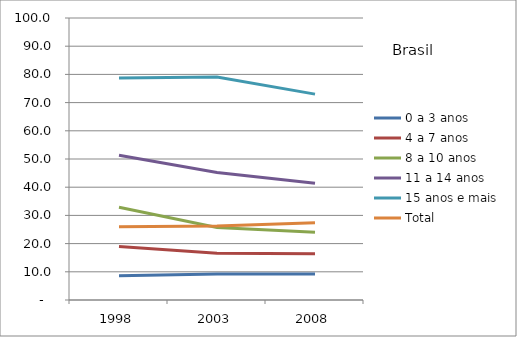
| Category | 0 a 3 anos | 4 a 7 anos | 8 a 10 anos | 11 a 14 anos | 15 anos e mais | Total |
|---|---|---|---|---|---|---|
| 1998 | 8.6 | 19 | 32.9 | 51.3 | 78.7 | 26 |
| 2003 | 9.2 | 16.6 | 25.7 | 45.2 | 79.1 | 26.2 |
| 2008 | 9.2 | 16.4 | 24 | 41.4 | 73 | 27.4 |